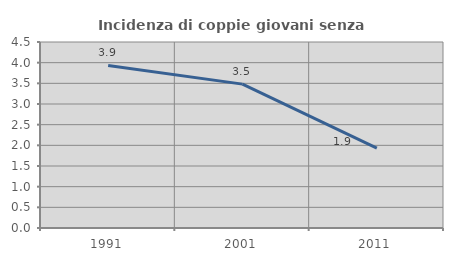
| Category | Incidenza di coppie giovani senza figli |
|---|---|
| 1991.0 | 3.934 |
| 2001.0 | 3.481 |
| 2011.0 | 1.933 |